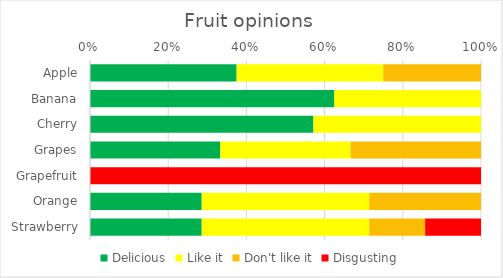
| Category | Delicious | Like it | Don't like it | Disgusting |
|---|---|---|---|---|
| Apple | 3 | 3 | 2 | 0 |
| Banana | 5 | 3 | 0 | 0 |
| Cherry | 4 | 3 | 0 | 0 |
| Grapes | 2 | 2 | 2 | 0 |
| Grapefruit | 0 | 0 | 0 | 8 |
| Orange | 2 | 3 | 2 | 0 |
| Strawberry | 2 | 3 | 1 | 1 |